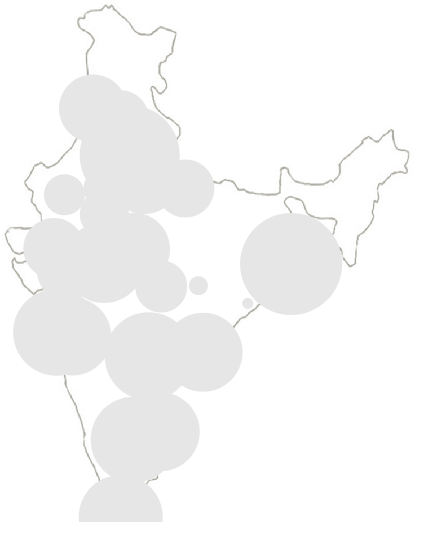
| Category | Series 0 |
|---|---|
| 78.01 | 27.11 |
| 72.37 | 23.2 |
| 74.8 | 31 |
| 77.35 | 12.59 |
| 77.36 | 23.16 |
| 84.52 | 20.15 |
| 76.55 | 30.44 |
| 79.01 | 13.04 |
| 76.14 | 9.58 |
| 77.12 | 28.38 |
| 78.29 | 17.23 |
| 75.5 | 22.44 |
| 75.52 | 26.55 |
| 86.1 | 22.5 |
| 73.04 | 26.18 |
| 87.24 | 22.34 |
| 75.52 | 25.1 |
| 80.59 | 26.55 |
| 72.54 | 18.55 |
| 79.09 | 21.09 |
| 77.32 | 28.57 |
| 73.52 | 18.32 |
| 81.41 | 21.15 |
| 76.55 | 8.29 |
| 73.16 | 22 |
| 81.7 | 17.45 |